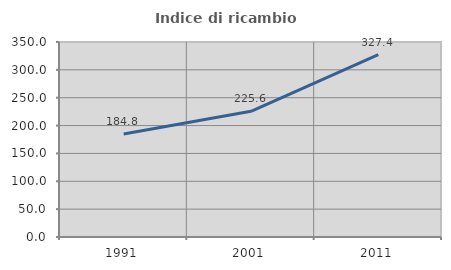
| Category | Indice di ricambio occupazionale  |
|---|---|
| 1991.0 | 184.8 |
| 2001.0 | 225.641 |
| 2011.0 | 327.397 |